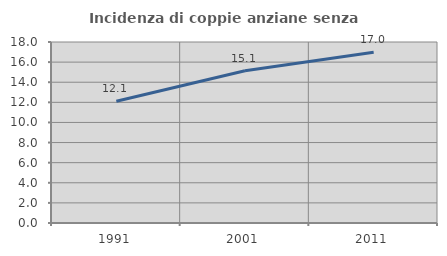
| Category | Incidenza di coppie anziane senza figli  |
|---|---|
| 1991.0 | 12.109 |
| 2001.0 | 15.141 |
| 2011.0 | 16.977 |